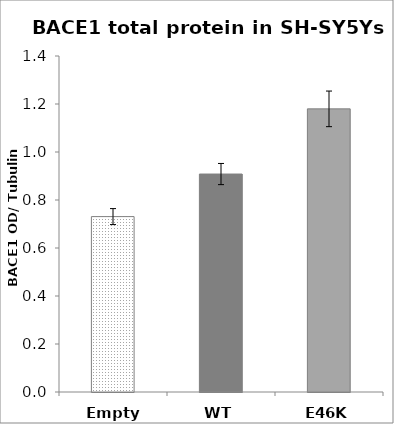
| Category | Series 0 |
|---|---|
| Empty vector | 0.731 |
| WT | 0.908 |
| E46K | 1.18 |